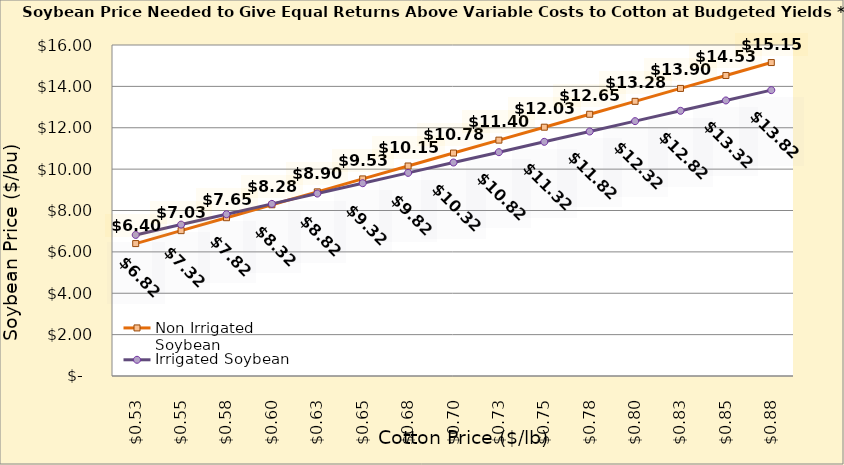
| Category | Non Irrigated Soybean | Irrigated Soybean |
|---|---|---|
| 0.5249999999999998 | 6.401 | 6.819 |
| 0.5499999999999998 | 7.026 | 7.319 |
| 0.5749999999999998 | 7.651 | 7.819 |
| 0.5999999999999999 | 8.276 | 8.319 |
| 0.6249999999999999 | 8.901 | 8.819 |
| 0.6499999999999999 | 9.526 | 9.319 |
| 0.6749999999999999 | 10.151 | 9.819 |
| 0.7 | 10.776 | 10.319 |
| 0.725 | 11.401 | 10.819 |
| 0.75 | 12.026 | 11.319 |
| 0.775 | 12.651 | 11.819 |
| 0.8 | 13.276 | 12.319 |
| 0.8250000000000001 | 13.901 | 12.819 |
| 0.8500000000000001 | 14.526 | 13.319 |
| 0.8750000000000001 | 15.151 | 13.819 |